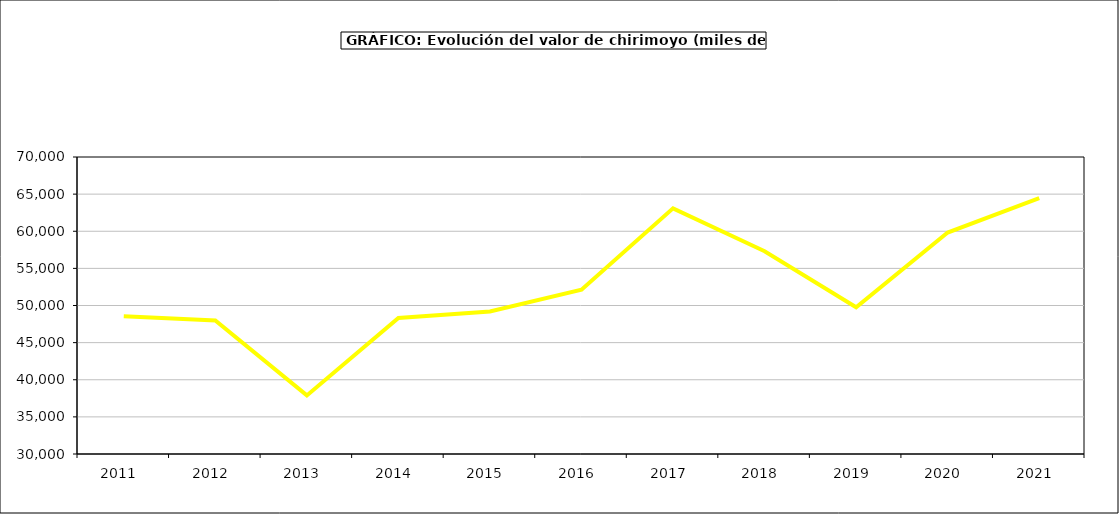
| Category | valor chirimoyo |
|---|---|
| 2011.0 | 48545.2 |
| 2012.0 | 47992.004 |
| 2013.0 | 37891.803 |
| 2014.0 | 48319.818 |
| 2015.0 | 49187 |
| 2016.0 | 52120 |
| 2017.0 | 63081.583 |
| 2018.0 | 57311.719 |
| 2019.0 | 49759.664 |
| 2020.0 | 59822.325 |
| 2021.0 | 64457.836 |